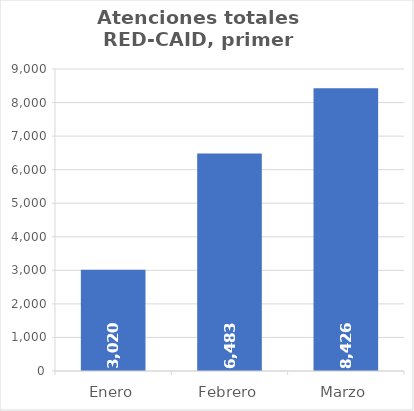
| Category | Series 0 |
|---|---|
| Enero | 3020 |
| Febrero | 6483 |
| Marzo | 8426 |